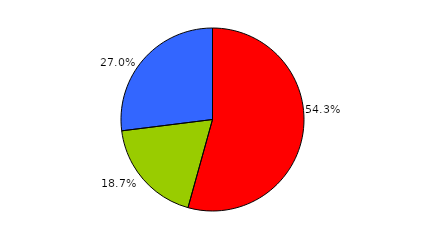
| Category | Series 0 |
|---|---|
| 0 | 151 |
| 1 | 52 |
| 2 | 75 |